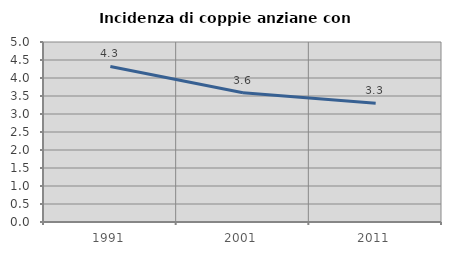
| Category | Incidenza di coppie anziane con figli |
|---|---|
| 1991.0 | 4.321 |
| 2001.0 | 3.593 |
| 2011.0 | 3.297 |